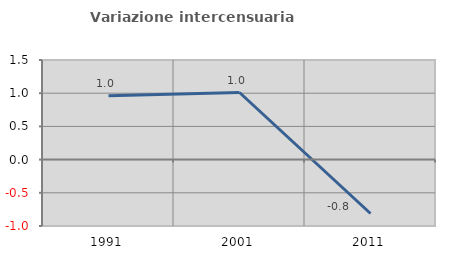
| Category | Variazione intercensuaria annua |
|---|---|
| 1991.0 | 0.963 |
| 2001.0 | 1.01 |
| 2011.0 | -0.812 |